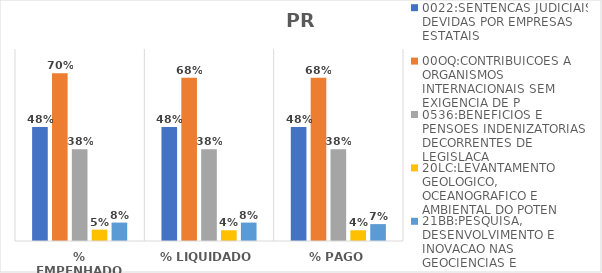
| Category | 0022:SENTENCAS JUDICIAIS DEVIDAS POR EMPRESAS ESTATAIS | 00OQ:CONTRIBUICOES A ORGANISMOS INTERNACIONAIS SEM EXIGENCIA DE P | 0536:BENEFICIOS E PENSOES INDENIZATORIAS DECORRENTES DE LEGISLACA | 20LC:LEVANTAMENTO GEOLOGICO, OCEANOGRAFICO E AMBIENTAL DO POTEN | 21BB:PESQUISA, DESENVOLVIMENTO E INOVACAO NAS GEOCIENCIAS E |
|---|---|---|---|---|---|
| % EMPENHADO | 0.475 | 0.699 | 0.383 | 0.047 | 0.077 |
| % LIQUIDADO | 0.475 | 0.681 | 0.383 | 0.045 | 0.077 |
| % PAGO | 0.475 | 0.681 | 0.383 | 0.045 | 0.07 |